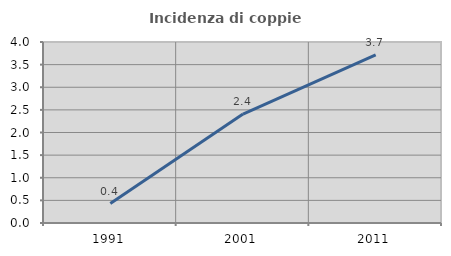
| Category | Incidenza di coppie miste |
|---|---|
| 1991.0 | 0.429 |
| 2001.0 | 2.407 |
| 2011.0 | 3.716 |